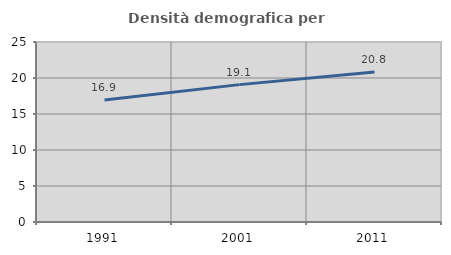
| Category | Densità demografica |
|---|---|
| 1991.0 | 16.949 |
| 2001.0 | 19.08 |
| 2011.0 | 20.829 |